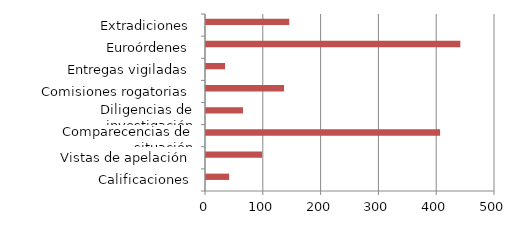
| Category | Series 0 | Series 1 |
|---|---|---|
| Calificaciones |  | 40 |
| Vistas de apelación |  | 97 |
| Comparecencias de situación |  | 405 |
| Diligencias de investigación |  | 64 |
| Comisiones rogatorias |  | 135 |
| Entregas vigiladas |  | 33 |
| Euroórdenes |  | 440 |
| Extradiciones |  | 144 |